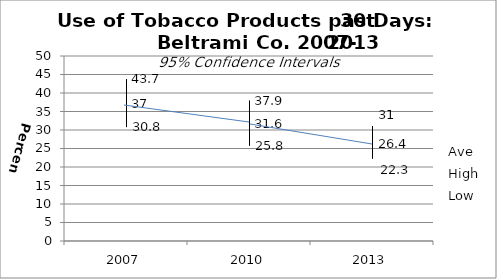
| Category | Ave | High | Low |
|---|---|---|---|
| 2007.0 | 37 | 43.7 | 30.8 |
| 2010.0 | 31.6 | 37.9 | 25.8 |
| 2013.0 | 26.4 | 31 | 22.3 |